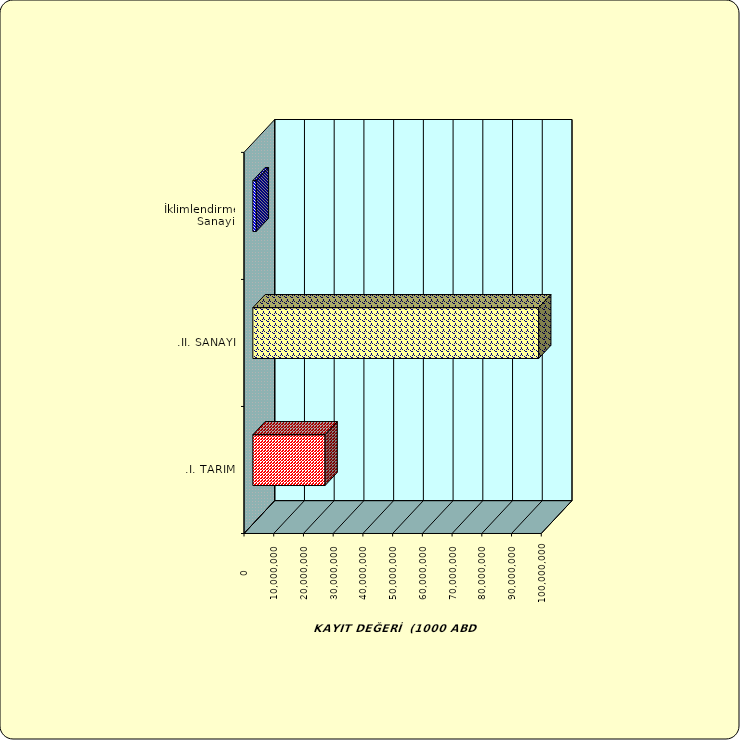
| Category | Series 0 |
|---|---|
| .I. TARIM | 24289807.022 |
| .II. SANAYİ | 96142549.971 |
|  İklimlendirme Sanayii | 1154731.477 |